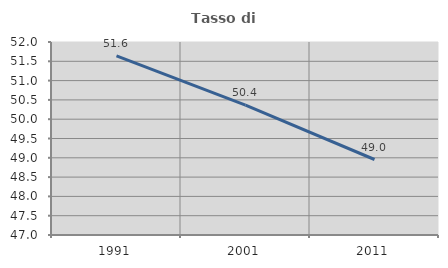
| Category | Tasso di occupazione   |
|---|---|
| 1991.0 | 51.641 |
| 2001.0 | 50.363 |
| 2011.0 | 48.956 |